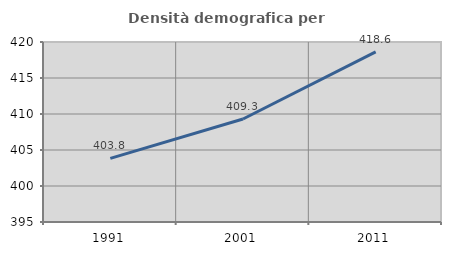
| Category | Densità demografica |
|---|---|
| 1991.0 | 403.835 |
| 2001.0 | 409.309 |
| 2011.0 | 418.635 |